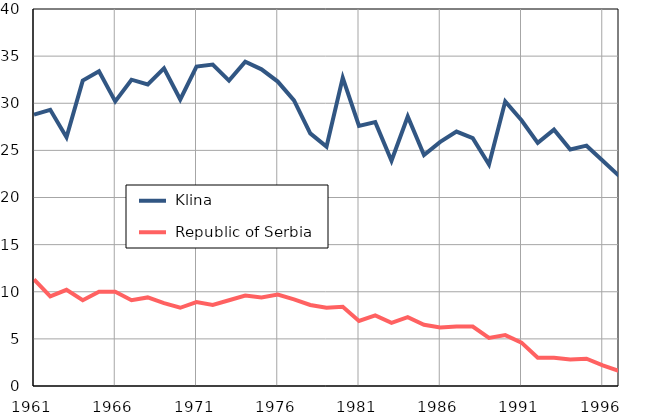
| Category |  Klina |  Republic of Serbia |
|---|---|---|
| 1961.0 | 28.8 | 11.3 |
| 1962.0 | 29.3 | 9.5 |
| 1963.0 | 26.4 | 10.2 |
| 1964.0 | 32.4 | 9.1 |
| 1965.0 | 33.4 | 10 |
| 1966.0 | 30.2 | 10 |
| 1967.0 | 32.5 | 9.1 |
| 1968.0 | 32 | 9.4 |
| 1969.0 | 33.7 | 8.8 |
| 1970.0 | 30.4 | 8.3 |
| 1971.0 | 33.9 | 8.9 |
| 1972.0 | 34.1 | 8.6 |
| 1973.0 | 32.4 | 9.1 |
| 1974.0 | 34.4 | 9.6 |
| 1975.0 | 33.6 | 9.4 |
| 1976.0 | 32.3 | 9.7 |
| 1977.0 | 30.3 | 9.2 |
| 1978.0 | 26.8 | 8.6 |
| 1979.0 | 25.4 | 8.3 |
| 1980.0 | 32.7 | 8.4 |
| 1981.0 | 27.6 | 6.9 |
| 1982.0 | 28 | 7.5 |
| 1983.0 | 23.9 | 6.7 |
| 1984.0 | 28.6 | 7.3 |
| 1985.0 | 24.5 | 6.5 |
| 1986.0 | 25.9 | 6.2 |
| 1987.0 | 27 | 6.3 |
| 1988.0 | 26.3 | 6.3 |
| 1989.0 | 23.5 | 5.1 |
| 1990.0 | 30.2 | 5.4 |
| 1991.0 | 28.2 | 4.6 |
| 1992.0 | 25.8 | 3 |
| 1993.0 | 27.2 | 3 |
| 1994.0 | 25.1 | 2.8 |
| 1995.0 | 25.5 | 2.9 |
| 1996.0 | 23.9 | 2.2 |
| 1997.0 | 22.3 | 1.6 |